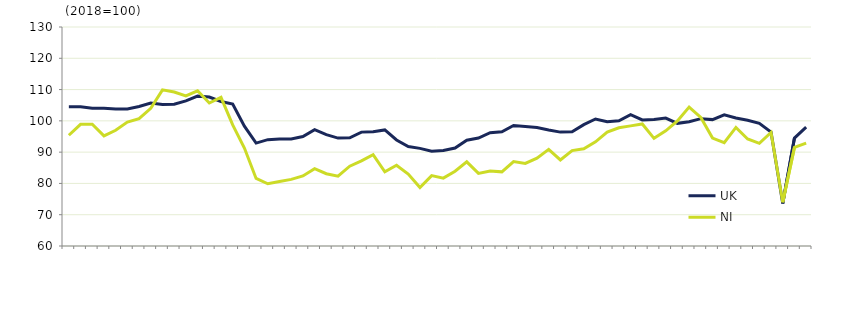
| Category | UK  | NI |
|---|---|---|
|  | 104.5 | 95.4 |
| Q2 2005 | 104.5 | 98.9 |
|  | 104 | 98.9 |
| Q4 2005 | 104 | 95.2 |
|  | 103.8 | 97 |
| Q2 2006 | 103.8 | 99.6 |
|  | 104.6 | 100.7 |
| Q4 2006 | 105.7 | 104 |
|  | 105.2 | 109.9 |
| Q2 2007 | 105.3 | 109.2 |
|  | 106.4 | 108 |
| Q4 2007 | 107.9 | 109.6 |
|  | 107.6 | 105.7 |
| Q2 2008 | 106.2 | 107.5 |
|  | 105.4 | 98.7 |
| Q4 2008 | 98.3 | 91.3 |
|  | 92.9 | 81.6 |
| Q2 2009 | 94 | 79.9 |
|  | 94.2 | 80.6 |
| Q4 2009 | 94.2 | 81.3 |
|  | 95 | 82.4 |
| Q2 2010 | 97.2 | 84.7 |
|  | 95.6 | 83.1 |
| Q4 2010 | 94.5 | 82.3 |
|  | 94.6 | 85.5 |
| Q2 2011 | 96.4 | 87.2 |
|  | 96.5 | 89.2 |
| Q4 2011 | 97.1 | 83.7 |
|  | 93.9 | 85.8 |
| Q2 2012 | 91.8 | 83 |
|  | 91.2 | 78.7 |
| Q4 2012 | 90.3 | 82.5 |
|  | 90.5 | 81.7 |
| Q2 2013 | 91.3 | 83.9 |
|  | 93.8 | 86.9 |
| Q4 2013 | 94.5 | 83.2 |
|  | 96.2 | 84 |
| Q2 2014 | 96.5 | 83.7 |
|  | 98.5 | 87 |
| Q4 2014 | 98.2 | 86.4 |
|  | 97.9 | 88.1 |
| Q2 2015 | 97.1 | 90.9 |
|  | 96.4 | 87.5 |
| Q4 2015 | 96.5 | 90.5 |
|  | 98.8 | 91.1 |
| Q2 2016 | 100.6 | 93.3 |
|  | 99.7 | 96.4 |
| Q4 2016 | 100 | 97.8 |
|  | 102 | 98.4 |
| Q2 2017 | 100.3 | 99 |
|  | 100.4 | 94.4 |
| Q4 2017 | 100.9 | 96.8 |
|  | 99.2 | 100 |
| Q2 2018 | 99.7 | 104.4 |
|  | 100.7 | 101.1 |
| Q4 2018 | 100.4 | 94.5 |
|  | 101.9 | 93 |
| Q2 2019 | 100.9 | 97.9 |
|  | 100.2 | 94.2 |
| Q4 2019 | 99.2 | 92.8 |
|  | 96.4 | 96.3 |
| Q2 2020 | 73.6 | 74 |
|  | 94.5 | 91.5 |
| Q4 2020 | 98 | 92.9 |